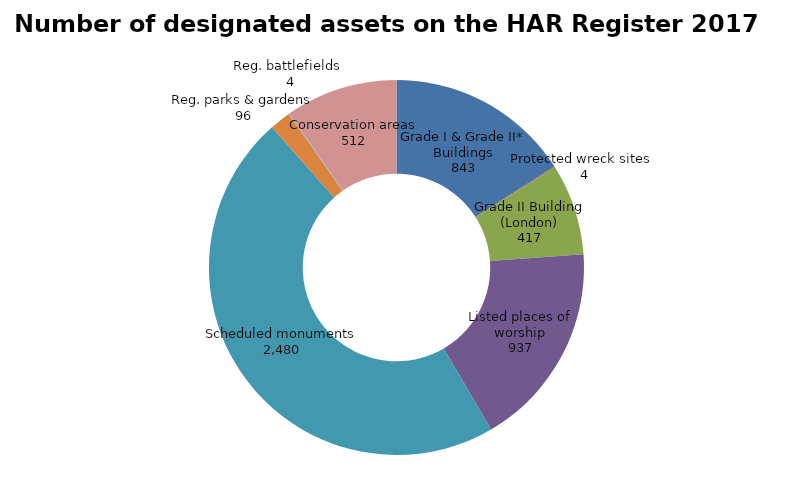
| Category | Number of designated assets on the HAR Register 2017 |
|---|---|
| Grade I & Grade II* Buildings | 843 |
| Protected wreck sites  | 4 |
| Grade II Building (London) | 417 |
| Listed places of worship | 937 |
| Scheduled monuments  | 2480 |
| Reg. parks & gardens | 96 |
| Reg. battlefields  | 4 |
| Conservation areas | 512 |